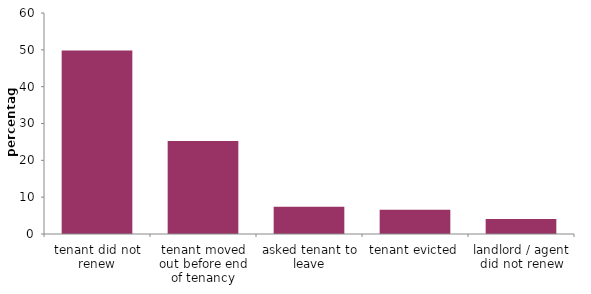
| Category | Series 0 |
|---|---|
| tenant did not renew | 49.834 |
| tenant moved out before end of tenancy | 25.243 |
| asked tenant to leave | 7.425 |
| tenant evicted | 6.575 |
| landlord / agent did not renew | 4.079 |